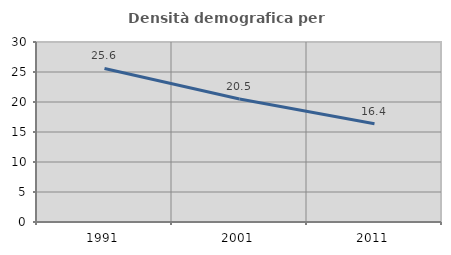
| Category | Densità demografica |
|---|---|
| 1991.0 | 25.587 |
| 2001.0 | 20.499 |
| 2011.0 | 16.39 |